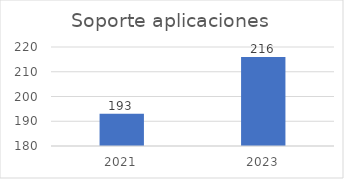
| Category | Series 0 |
|---|---|
| 2021.0 | 193 |
| 2023.0 | 216 |